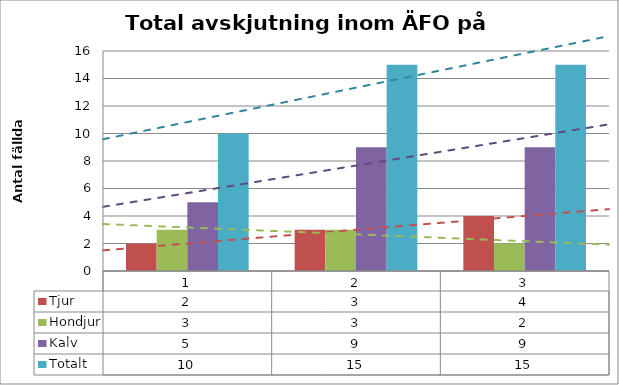
| Category | Tjur | Hondjur | Kalv | Totalt |
|---|---|---|---|---|
| 0 | 2 | 3 | 5 | 10 |
| 1 | 3 | 3 | 9 | 15 |
| 2 | 4 | 2 | 9 | 15 |